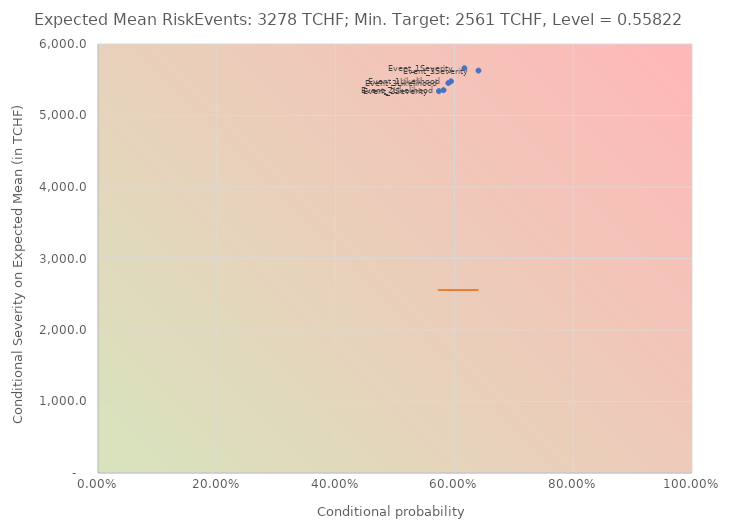
| Category | Series 0 |
|---|---|
| 0.594289635192315 | 5477.808 |
| 0.6168756718022215 | 5661.176 |
| 0.5818057998978492 | 5354.954 |
| 0.573916159082766 | 5340.792 |
| 0.5897416442201905 | 5454.357 |
| 0.6405947689000359 | 5627.813 |